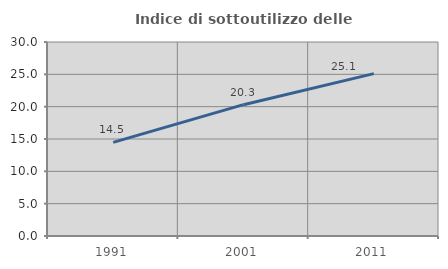
| Category | Indice di sottoutilizzo delle abitazioni  |
|---|---|
| 1991.0 | 14.479 |
| 2001.0 | 20.308 |
| 2011.0 | 25.105 |